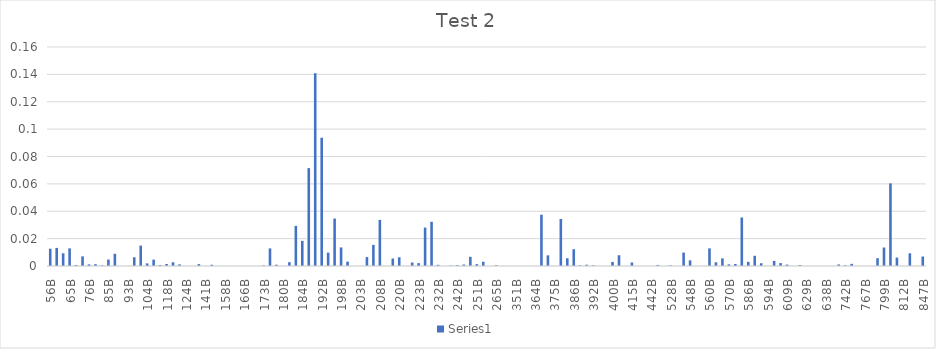
| Category | Series 0 |
|---|---|
| 56B | 0.013 |
| 59B | 0.013 |
| 62B | 0.009 |
| 65B | 0.013 |
| 67B | 0.001 |
| 72B | 0.007 |
| 76B | 0.001 |
| 79B | 0.001 |
| 82B | 0 |
| 85B | 0.005 |
| 88B | 0.009 |
| 91B | 0 |
| 93B | 0 |
| 99B | 0.006 |
| 102B | 0.015 |
| 104B | 0.002 |
| 106B | 0.005 |
| 112B | 0.001 |
| 118B | 0.001 |
| 120B | 0.003 |
| 122B | 0.001 |
| 124B | 0 |
| 128B | 0 |
| 132B | 0.001 |
| 141B | 0 |
| 144B | 0.001 |
| 155B | 0 |
| 158B | 0 |
| 163B | 0 |
| 165B | 0 |
| 166B | 0 |
| 169B | 0 |
| 171B | 0 |
| 173B | 0 |
| 175B | 0.013 |
| 178B | 0.001 |
| 180B | 0 |
| 182B | 0.003 |
| 186B | 0.029 |
| 184B | 0.018 |
| 188B | 0.072 |
| 189B | 0.141 |
| 192B | 0.094 |
| 195B | 0.01 |
| 197B | 0.035 |
| 198B | 0.014 |
| 201B | 0.003 |
| 203B | 0 |
| 203B | 0 |
| 207B | 0.007 |
| 209B | 0.015 |
| 208B | 0.034 |
| 212B | 0 |
| 216B | 0.005 |
| 220B | 0.006 |
| 220B | 0 |
| 223B | 0.003 |
| 223B | 0.002 |
| 226B | 0.028 |
| 230B | 0.032 |
| 232B | 0.001 |
| 234B | 0 |
| 238B | 0 |
| 242B | 0.001 |
| 246B | 0.001 |
| 246B | 0.007 |
| 251B | 0.001 |
| 260B | 0.003 |
| 262B | 0 |
| 265B | 0.001 |
| 269B | 0 |
| 274B | 0 |
| 351B | 0 |
| 359B | 0 |
| 360B | 0 |
| 364B | 0 |
| 371B | 0.037 |
| 373B | 0.008 |
| 375B | 0 |
| 380B | 0.034 |
| 381B | 0.006 |
| 386B | 0.012 |
| 388B | 0 |
| 388B | 0.001 |
| 392B | 0 |
| 394B | 0 |
| 397B | 0 |
| 400B | 0.003 |
| 407B | 0.008 |
| 413B | 0 |
| 415B | 0.003 |
| 420B | 0 |
| 421B | 0 |
| 442B | 0 |
| 492B | 0.001 |
| 526B | 0 |
| 528B | 0 |
| 540B | 0 |
| 546B | 0.01 |
| 548B | 0.004 |
| 550B | 0 |
| 553B | 0 |
| 560B | 0.013 |
| 564B | 0.003 |
| 567B | 0.006 |
| 570B | 0.001 |
| 575B | 0.001 |
| 579B | 0.035 |
| 586B | 0.003 |
| 588B | 0.007 |
| 590B | 0.002 |
| 594B | 0 |
| 598B | 0.004 |
| 607B | 0.002 |
| 609B | 0.001 |
| 609B | 0 |
| 613B | 0.001 |
| 629B | 0 |
| 631B | 0 |
| 633B | 0 |
| 638B | 0 |
| 694B | 0 |
| 726B | 0.001 |
| 742B | 0.001 |
| 744B | 0.002 |
| 748B | 0 |
| 767B | 0 |
| 786B | 0 |
| 797B | 0.006 |
| 799B | 0.014 |
| 806B | 0.06 |
| 809B | 0.006 |
| 812B | 0 |
| 815B | 0.009 |
| 827B | 0 |
| 847B | 0.007 |